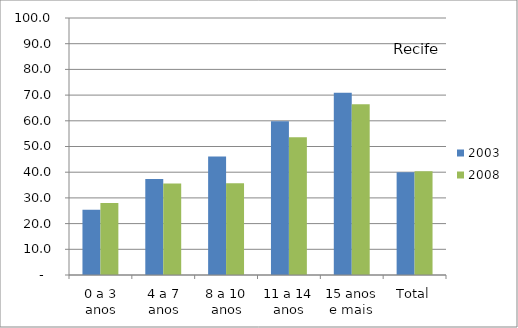
| Category | 2003 | 2008 |
|---|---|---|
| 0 a 3 anos | 25.4 | 27.97 |
| 4 a 7 anos | 37.38 | 35.61 |
| 8 a 10 anos | 46.11 | 35.72 |
| 11 a 14 anos | 59.78 | 53.64 |
| 15 anos e mais | 70.91 | 66.46 |
| Total | 39.95 | 40.38 |